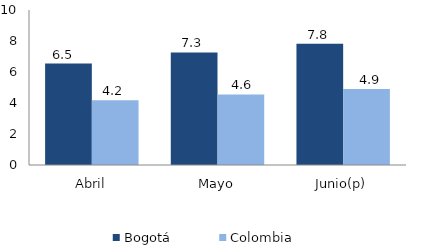
| Category | Bogotá | Colombia |
|---|---|---|
| Abril | 6.547 | 4.17 |
| Mayo | 7.261 | 4.555 |
| Junio(p) | 7.827 | 4.903 |